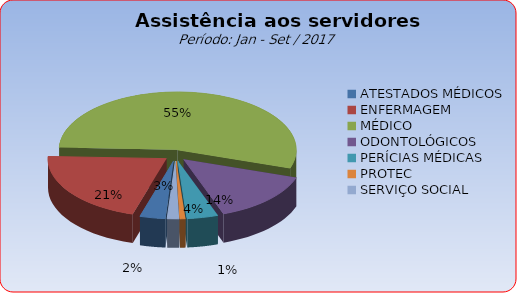
| Category | Series 0 |
|---|---|
| ATESTADOS MÉDICOS | 3.478 |
| ENFERMAGEM | 21.006 |
| MÉDICO | 54.51 |
| ODONTOLÓGICOS | 14.443 |
| PERÍCIAS MÉDICAS | 4.225 |
| PROTEC | 0.727 |
| SERVIÇO SOCIAL | 1.611 |